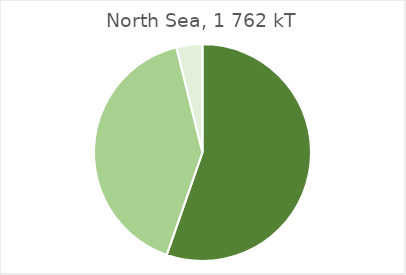
| Category | North Sea |
|---|---|
| Landings of assessed stocks for which adequate information is available to determine GES for F and/or SSB | 975056.721 |
| Landings of assessed stocks for which insufficient information is available to determine GES for F and/or SSB | 718435.37 |
| Landings unassessed stocks | 68471.618 |